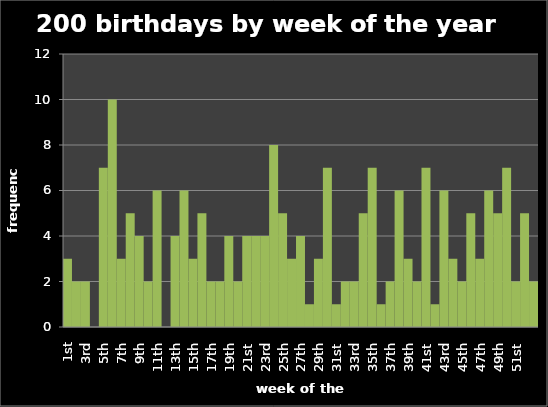
| Category | freq week |
|---|---|
| 1st | 3 |
| 2nd | 2 |
| 3rd | 2 |
| 4th | 0 |
| 5th | 7 |
| 6th | 10 |
| 7th | 3 |
| 8th | 5 |
| 9th | 4 |
| 10th | 2 |
| 11th | 6 |
| 12th | 0 |
| 13th | 4 |
| 14th | 6 |
| 15th | 3 |
| 16th | 5 |
| 17th | 2 |
| 18th | 2 |
| 19th | 4 |
| 20th | 2 |
| 21st | 4 |
| 22nd | 4 |
| 23rd | 4 |
| 24th | 8 |
| 25th | 5 |
| 26th | 3 |
| 27th | 4 |
| 28th | 1 |
| 29th | 3 |
| 30th | 7 |
| 31st | 1 |
| 32nd | 2 |
| 33rd | 2 |
| 34th | 5 |
| 35th | 7 |
| 36th | 1 |
| 37th | 2 |
| 38th | 6 |
| 39th | 3 |
| 40th | 2 |
| 41st | 7 |
| 42nd | 1 |
| 43rd | 6 |
| 44th | 3 |
| 45th | 2 |
| 46th | 5 |
| 47th | 3 |
| 48th | 6 |
| 49th | 5 |
| 50th | 7 |
| 51st | 2 |
| 52nd | 5 |